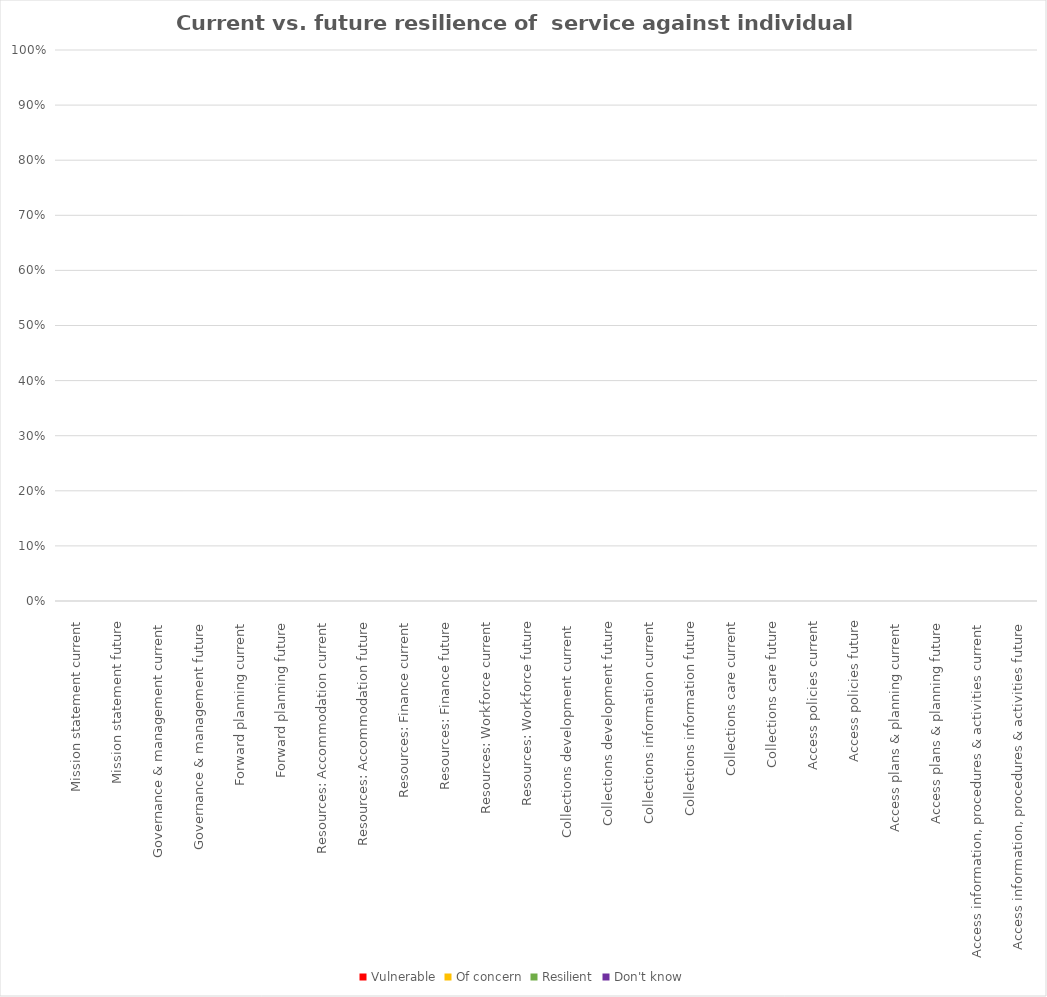
| Category | Vulnerable | Of concern | Resilient | Don't know |
|---|---|---|---|---|
| Mission statement current | 0 | 0 | 0 | 0 |
| Mission statement future | 0 | 0 | 0 | 0 |
| Governance & management current | 0 | 0 | 0 | 0 |
| Governance & management future | 0 | 0 | 0 | 0 |
| Forward planning current | 0 | 0 | 0 | 0 |
| Forward planning future | 0 | 0 | 0 | 0 |
| Resources: Accommodation current | 0 | 0 | 0 | 0 |
| Resources: Accommodation future | 0 | 0 | 0 | 0 |
| Resources: Finance current | 0 | 0 | 0 | 0 |
| Resources: Finance future | 0 | 0 | 0 | 0 |
| Resources: Workforce current | 0 | 0 | 0 | 0 |
| Resources: Workforce future | 0 | 0 | 0 | 0 |
| Collections development current  | 0 | 0 | 0 | 0 |
| Collections development future | 0 | 0 | 0 | 0 |
| Collections information current | 0 | 0 | 0 | 0 |
| Collections information future | 0 | 0 | 0 | 0 |
| Collections care current | 0 | 0 | 0 | 0 |
| Collections care future | 0 | 0 | 0 | 0 |
| Access policies current | 0 | 0 | 0 | 0 |
| Access policies future | 0 | 0 | 0 | 0 |
| Access plans & planning current | 0 | 0 | 0 | 0 |
| Access plans & planning future | 0 | 0 | 0 | 0 |
| Access information, procedures & activities current | 0 | 0 | 0 | 0 |
| Access information, procedures & activities future | 0 | 0 | 0 | 0 |